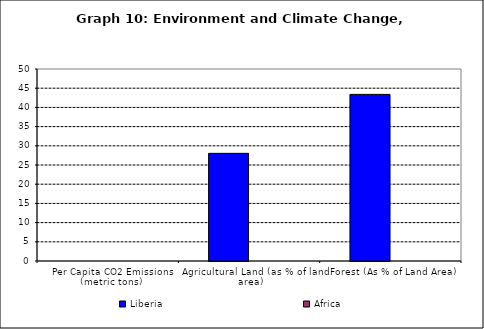
| Category | Liberia | Africa |
|---|---|---|
| Per Capita CO2 Emissions (metric tons) | 0 | 0 |
| Agricultural Land (as % of land area) | 28.032 | 0 |
| Forest (As % of Land Area) | 43.387 | 0 |